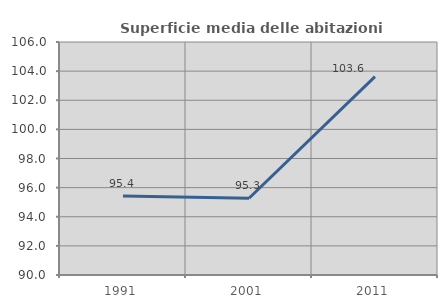
| Category | Superficie media delle abitazioni occupate |
|---|---|
| 1991.0 | 95.425 |
| 2001.0 | 95.267 |
| 2011.0 | 103.626 |